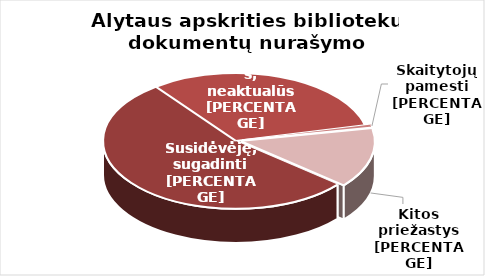
| Category | Series 0 |
|---|---|
| 0 | 42684 |
| 1 | 25158 |
| 2 | 545 |
| 3 | 11261 |